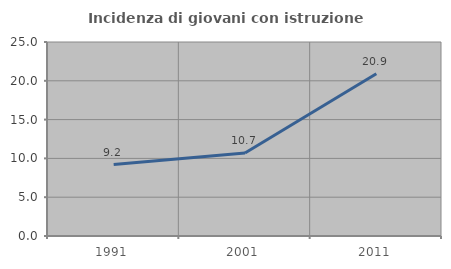
| Category | Incidenza di giovani con istruzione universitaria |
|---|---|
| 1991.0 | 9.202 |
| 2001.0 | 10.698 |
| 2011.0 | 20.913 |